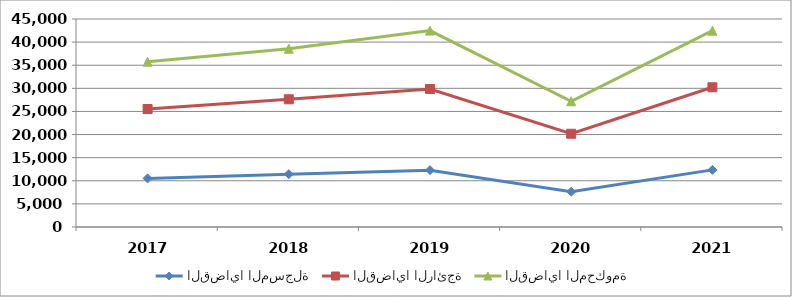
| Category | القضايا المسجلة | القضايا الرائجة | القضايا المحكومة |
|---|---|---|---|
| 2017.0 | 10519 | 15009 | 10236 |
| 2018.0 | 11428 | 16201 | 10942 |
| 2019.0 | 12297 | 17555 | 12639 |
| 2020.0 | 7628 | 12544 | 7035 |
| 2021.0 | 12361 | 17870 | 12236 |